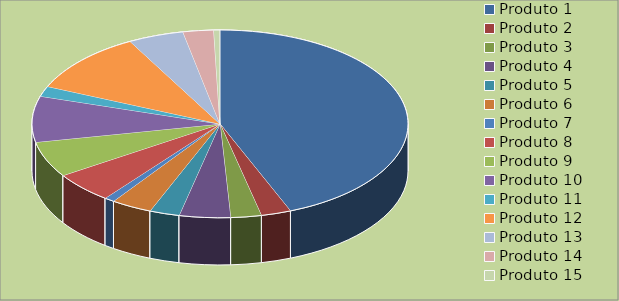
| Category | Series 0 |
|---|---|
| Produto 1 | 5000 |
| Produto 2 | 294 |
| Produto 3 | 300 |
| Produto 4 | 500 |
| Produto 5 | 294 |
| Produto 6 | 400 |
| Produto 7 | 100 |
| Produto 8 | 600 |
| Produto 9 | 700 |
| Produto 10 | 900 |
| Produto 11 | 200 |
| Produto 12 | 1200 |
| Produto 13 | 544 |
| Produto 14 | 300 |
| Produto 15 | 60 |